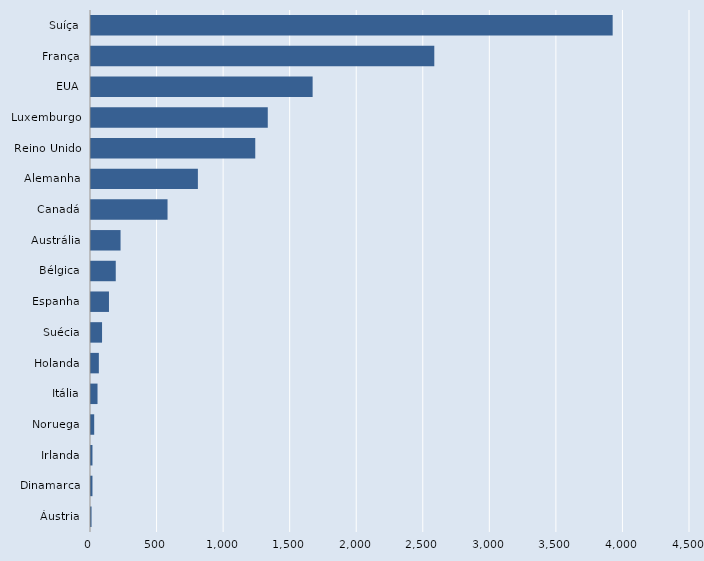
| Category | Series 0 |
|---|---|
| Áustria | 4 |
| Dinamarca | 11 |
| Irlanda | 11 |
| Noruega | 24 |
| Itália | 49 |
| Holanda | 59 |
| Suécia | 83 |
| Espanha | 135 |
| Bélgica | 186 |
| Austrália | 222 |
| Canadá | 575 |
| Alemanha | 803 |
| Reino Unido | 1234 |
| Luxemburgo | 1328 |
| EUA | 1665 |
| França | 2579 |
| Suíça | 3919 |